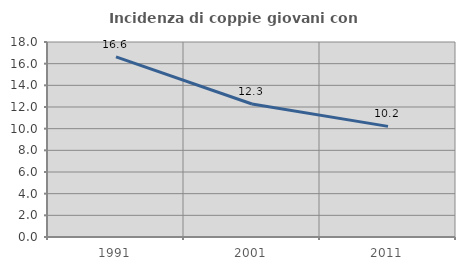
| Category | Incidenza di coppie giovani con figli |
|---|---|
| 1991.0 | 16.624 |
| 2001.0 | 12.277 |
| 2011.0 | 10.21 |